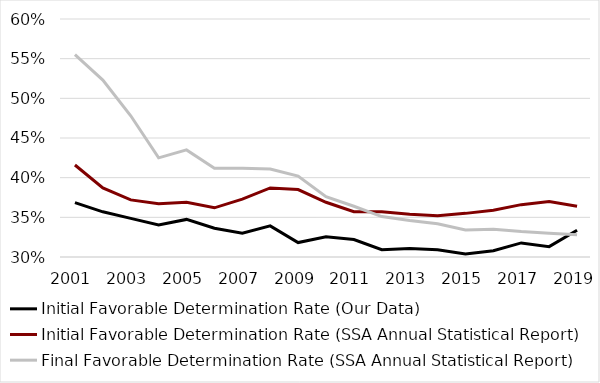
| Category | Initial Favorable Determination Rate (Our Data) | Initial Favorable Determination Rate (SSA Annual Statistical Report) | Final Favorable Determination Rate (SSA Annual Statistical Report) |
|---|---|---|---|
| 2001.0 | 0.369 | 0.416 | 0.555 |
| 2002.0 | 0.357 | 0.387 | 0.523 |
| 2003.0 | 0.349 | 0.372 | 0.478 |
| 2004.0 | 0.34 | 0.367 | 0.425 |
| 2005.0 | 0.347 | 0.369 | 0.435 |
| 2006.0 | 0.336 | 0.362 | 0.412 |
| 2007.0 | 0.33 | 0.373 | 0.412 |
| 2008.0 | 0.339 | 0.387 | 0.411 |
| 2009.0 | 0.318 | 0.385 | 0.402 |
| 2010.0 | 0.325 | 0.369 | 0.376 |
| 2011.0 | 0.322 | 0.357 | 0.364 |
| 2012.0 | 0.309 | 0.357 | 0.351 |
| 2013.0 | 0.311 | 0.354 | 0.346 |
| 2014.0 | 0.309 | 0.352 | 0.342 |
| 2015.0 | 0.304 | 0.355 | 0.334 |
| 2016.0 | 0.308 | 0.359 | 0.335 |
| 2017.0 | 0.318 | 0.366 | 0.332 |
| 2018.0 | 0.313 | 0.37 | 0.33 |
| 2019.0 | 0.334 | 0.364 | 0.328 |